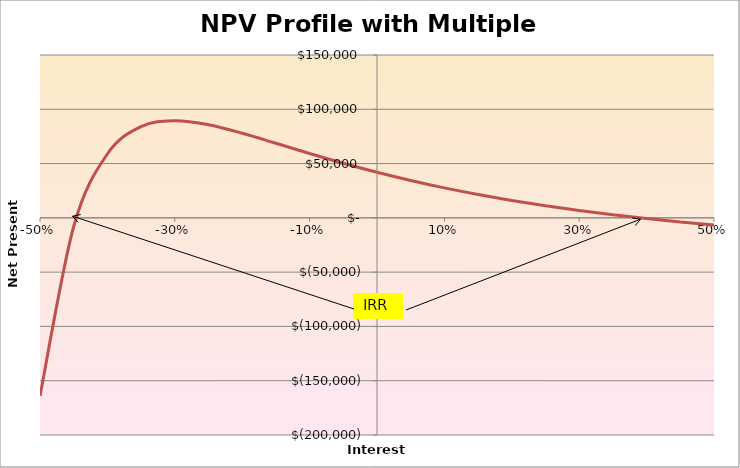
| Category | Series 1 |
|---|---|
| -0.5 | -164000 |
| -0.45 | -7975.424 |
| -0.4 | 58847.737 |
| -0.35 | 84011.953 |
| -0.3 | 89462.724 |
| -0.25 | 85720.165 |
| -0.200000000000001 | 77954.102 |
| -0.150000000000001 | 68732.591 |
| -0.100000000000001 | 59321.919 |
| -0.0500000000000009 | 50324.3 |
| -9.99200722162641e-16 | 42000 |
| 0.049999999999999 | 34433.784 |
| 0.099999999999999 | 27622.306 |
| 0.149999999999999 | 21520.38 |
| 0.199999999999999 | 16065.458 |
| 0.249999999999999 | 11190.4 |
| 0.299999999999999 | 6829.916 |
| 0.349999999999999 | 2923.564 |
| 0.399999999999999 | -583.09 |
| 0.45 | -3738.286 |
| 0.5 | -6584.362 |
| 0.55 | -9158.268 |
| 0.6 | -11492.157 |